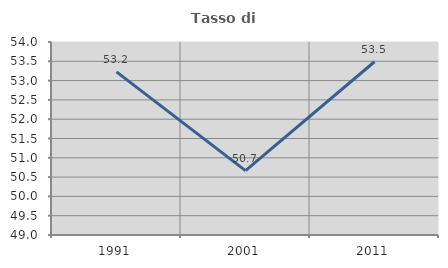
| Category | Tasso di occupazione   |
|---|---|
| 1991.0 | 53.226 |
| 2001.0 | 50.667 |
| 2011.0 | 53.488 |